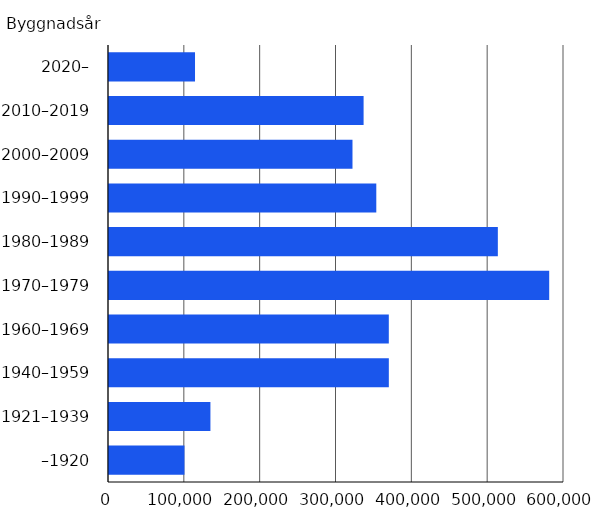
| Category | Antal bostäder |
|---|---|
| –1920 | 99510 |
| 1921–1939 | 133747 |
| 1940–1959 | 369012 |
| 1960–1969 | 368981 |
| 1970–1979 | 580485 |
| 1980–1989 | 512761 |
| 1990–1999 | 352478 |
| 2000–2009 | 321082 |
| 2010–2019 | 335730 |
| 2020– | 113424 |